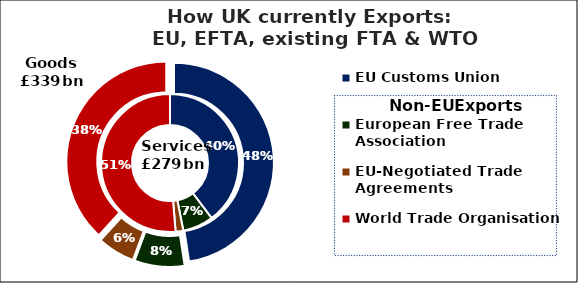
| Category | UK Services | UK Goods |
|---|---|---|
| EU Customs Union | 0.397 | 0.476 |
| European Free Trade Association | 0.072 | 0.081 |
| EU-Negotiated Trade Agreements | 0.018 | 0.061 |
| World Trade Organisation | 0.513 | 0.382 |